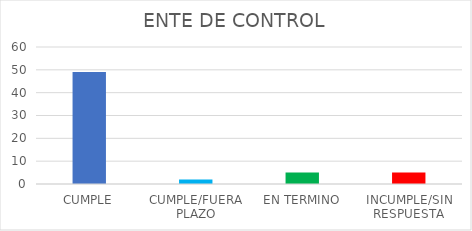
| Category | Series 0 |
|---|---|
| CUMPLE | 49 |
| CUMPLE/FUERA PLAZO | 2 |
| EN TERMINO | 5 |
| INCUMPLE/SIN RESPUESTA | 5 |